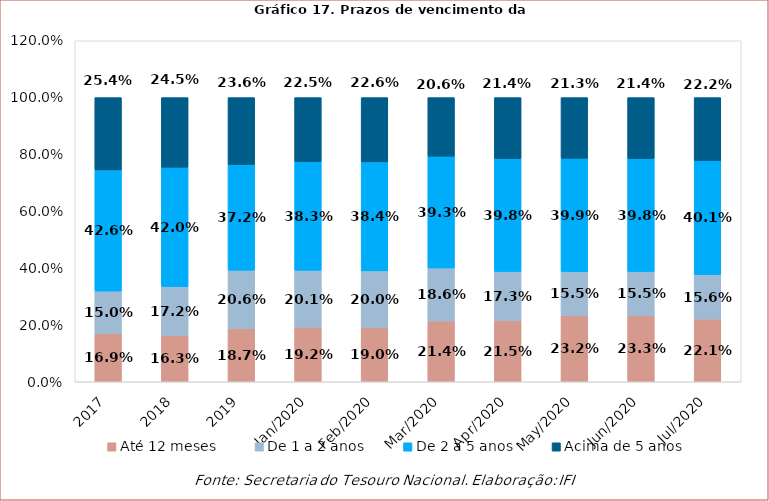
| Category | Até 12 meses | De 1 a 2 anos | De 2 a 5 anos | Acima de 5 anos |
|---|---|---|---|---|
| 2017.0 | 0.169 | 0.15 | 0.426 | 0.254 |
| 2018.0 | 0.163 | 0.172 | 0.42 | 0.245 |
| 2019.0 | 0.187 | 0.206 | 0.372 | 0.236 |
| 43831.0 | 0.192 | 0.201 | 0.383 | 0.225 |
| 43862.0 | 0.19 | 0.2 | 0.384 | 0.226 |
| 43891.0 | 0.214 | 0.186 | 0.393 | 0.206 |
| 43922.0 | 0.215 | 0.173 | 0.398 | 0.214 |
| 43952.0 | 0.232 | 0.155 | 0.399 | 0.213 |
| 43983.0 | 0.233 | 0.155 | 0.398 | 0.214 |
| 44013.0 | 0.221 | 0.156 | 0.401 | 0.222 |